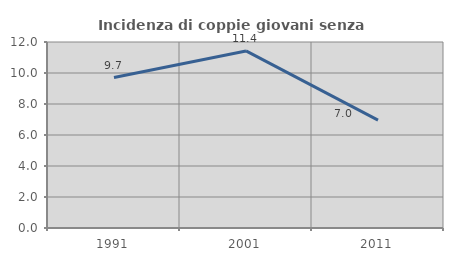
| Category | Incidenza di coppie giovani senza figli |
|---|---|
| 1991.0 | 9.707 |
| 2001.0 | 11.423 |
| 2011.0 | 6.96 |